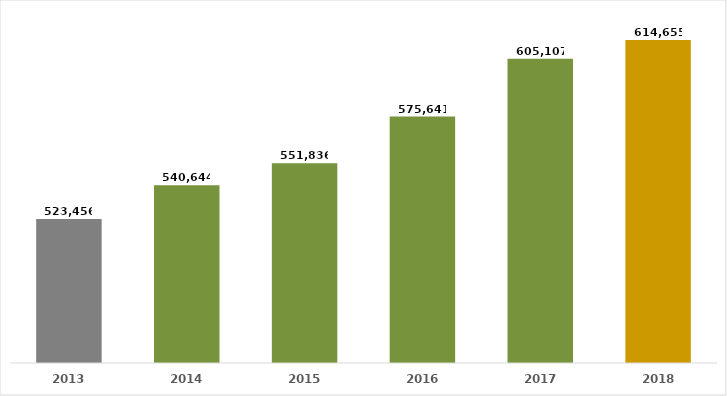
| Category | Series 0 |
|---|---|
| 2013.0 | 523456 |
| 2014.0 | 540644 |
| 2015.0 | 551836 |
| 2016.0 | 575641 |
| 2017.0 | 605107 |
| 2018.0 | 614655 |